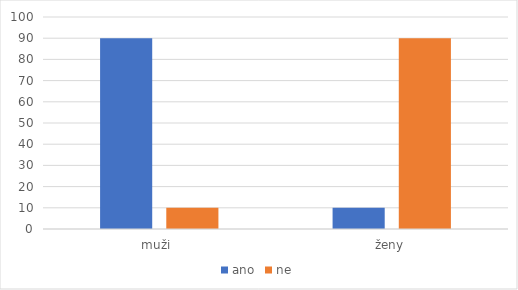
| Category | ano | ne |
|---|---|---|
| muži  | 90 | 10 |
| ženy | 10 | 90 |